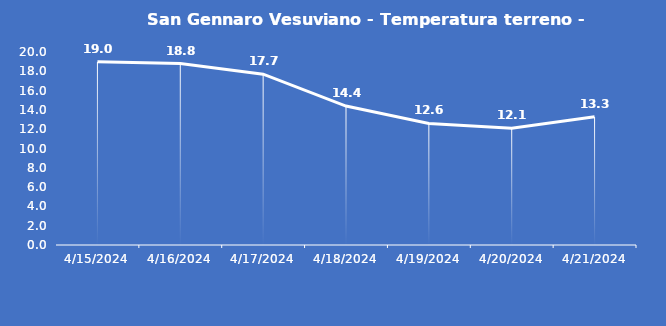
| Category | San Gennaro Vesuviano - Temperatura terreno - Grezzo (°C) |
|---|---|
| 4/15/24 | 19 |
| 4/16/24 | 18.8 |
| 4/17/24 | 17.7 |
| 4/18/24 | 14.4 |
| 4/19/24 | 12.6 |
| 4/20/24 | 12.1 |
| 4/21/24 | 13.3 |